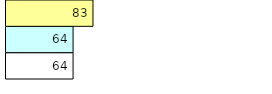
| Category | Total Standouts | Total Recd | Total Tipsters |
|---|---|---|---|
| 0 | 64 | 64 | 83 |